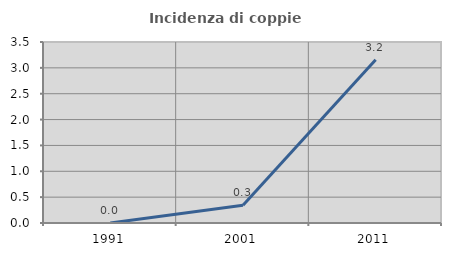
| Category | Incidenza di coppie miste |
|---|---|
| 1991.0 | 0 |
| 2001.0 | 0.344 |
| 2011.0 | 3.155 |